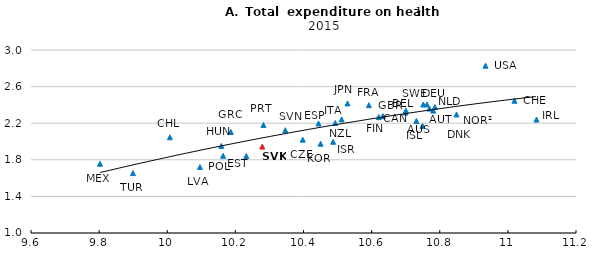
| Category | Series 0 |
|---|---|
| 10.7313622850367 | 2.225 |
| 10.7808503283994 | 2.338 |
| 10.7006117922191 | 2.338 |
| 10.6989656641935 | 2.317 |
| 11.0193174308213 | 2.445 |
| 10.0077124235937 | 2.046 |
| 10.3977263726977 | 2.02 |
| 10.7625939878824 | 2.405 |
| 10.7696632429784 | 2.36 |
| 10.4441826099044 | 2.197 |
| 10.2320716163083 | 1.841 |
| 10.6210834134984 | 2.266 |
| 10.5919487711054 | 2.397 |
| 10.6328943357164 | 2.278 |
| 10.1866720259355 | 2.105 |
| 10.1586722593951 | 1.952 |
| 11.0840330684114 | 2.24 |
| 10.7494845671903 | 2.171 |
| 10.4869872637915 | 1.997 |
| 10.4932722201009 | 2.203 |
| 10.5291853127325 | 2.417 |
| 10.4501338852169 | 1.975 |
| 10.0959656895395 | 1.721 |
| 9.80245100835836 | 1.757 |
| 10.7857249970854 | 2.376 |
| 10.8491667013493 | 2.296 |
| 10.511893504641 | 2.242 |
| 10.163888352206 | 1.844 |
| 10.2824033254108 | 2.181 |
| 10.2789744371246 | 1.945 |
| 10.346601626429 | 2.123 |
| 10.7515422692924 | 2.404 |
| 9.89932891738727 | 1.655 |
| 10.9342848471758 | 2.828 |